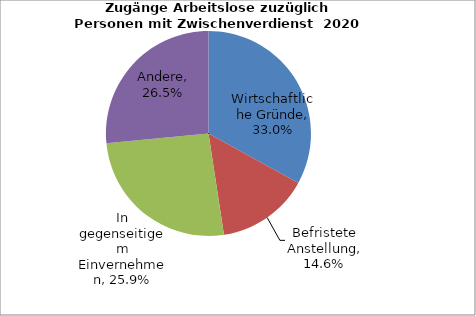
| Category | Series 0 |
|---|---|
| Wirtschaftliche Gründe | 0.33 |
| Befristete Anstellung | 0.146 |
| In gegenseitigem Einvernehmen | 0.259 |
| Andere | 0.265 |